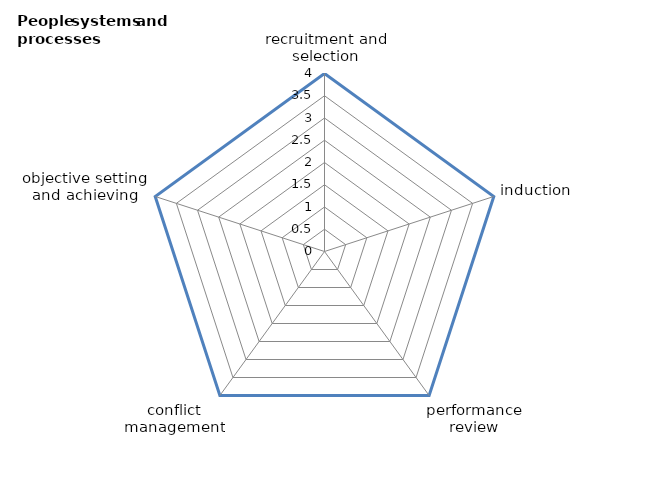
| Category | Series 0 | Series 1 |
|---|---|---|
| recruitment and selection | 4 | 0 |
| induction | 4 | 0 |
| performance review | 4 | 0 |
| conflict management | 4 | 0 |
| objective setting and achieving | 4 | 0 |